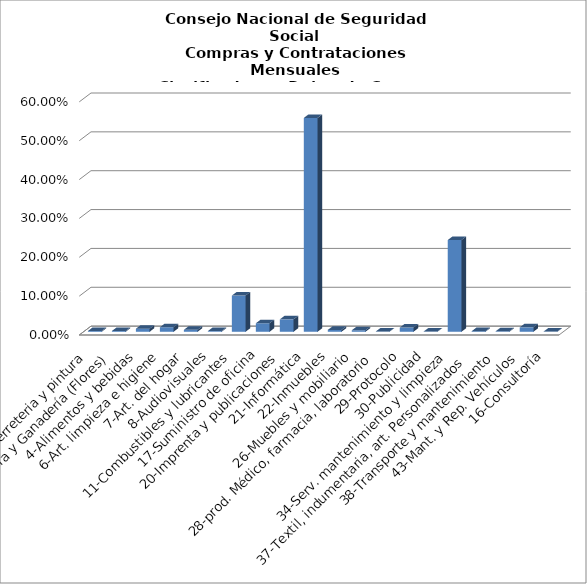
| Category | Series 0 |
|---|---|
| 2-Ferreteria y pintura | 0.002 |
| 3-Agricultura y Ganadería (Flores) | 0.002 |
| 4-Alimentos y bebidas | 0.008 |
| 6-Art. limpieza e higiene | 0.012 |
| 7-Art. del hogar | 0.005 |
| 8-Audiovisuales | 0.002 |
| 11-Combustibles y lubricantes | 0.093 |
| 17-Suministro de oficina | 0.022 |
| 20-Imprenta y publicaciones | 0.032 |
| 21-Informática | 0.55 |
| 22-Inmuebles  | 0.005 |
| 26-Muebles y mobiliario | 0.004 |
| 28-prod. Médico, farmacia, laboratorio | 0.001 |
| 29-Protocolo | 0.011 |
| 30-Publicidad | 0.001 |
| 34-Serv. mantenimiento y limpieza | 0.236 |
| 37-Textil, indumentaria, art. Personalizados | 0.002 |
| 38-Transporte y mantenimiento | 0.001 |
| 43-Mant. y Rep. Vehículos | 0.011 |
| 16-Consultoría | 0.001 |